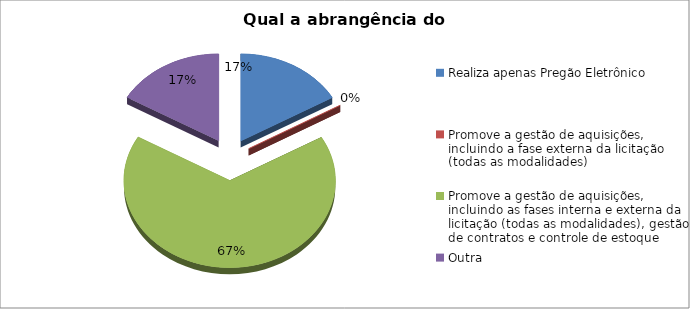
| Category | Series 0 |
|---|---|
| Realiza apenas Pregão Eletrônico | 0.167 |
| Promove a gestão de aquisições, incluindo a fase externa da licitação (todas as modalidades) | 0 |
| Promove a gestão de aquisições, incluindo as fases interna e externa da licitação (todas as modalidades), gestão de contratos e controle de estoque | 0.667 |
| Outra | 0.167 |